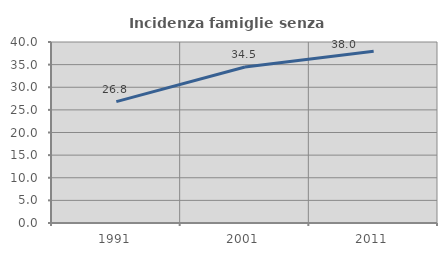
| Category | Incidenza famiglie senza nuclei |
|---|---|
| 1991.0 | 26.829 |
| 2001.0 | 34.463 |
| 2011.0 | 37.962 |